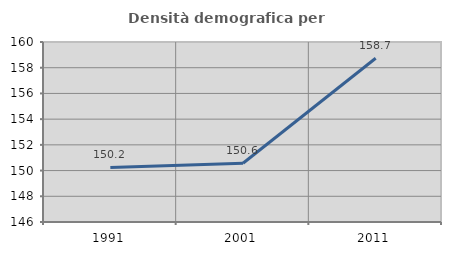
| Category | Densità demografica |
|---|---|
| 1991.0 | 150.246 |
| 2001.0 | 150.571 |
| 2011.0 | 158.735 |